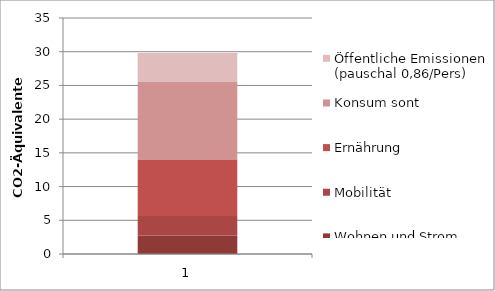
| Category | Wohnen und Strom | Mobilität | Ernährung | Konsum sont | Öffentliche Emissionen (pauschal 0,86/Pers) |
|---|---|---|---|---|---|
| 0 | 2.74 | 2.9 | 8.3 | 11.58 | 4.3 |